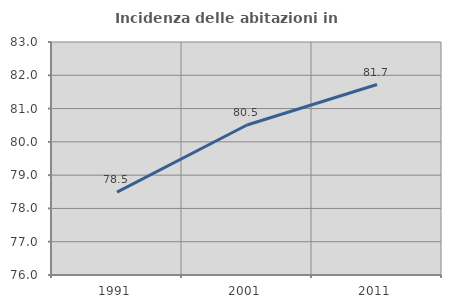
| Category | Incidenza delle abitazioni in proprietà  |
|---|---|
| 1991.0 | 78.49 |
| 2001.0 | 80.506 |
| 2011.0 | 81.722 |